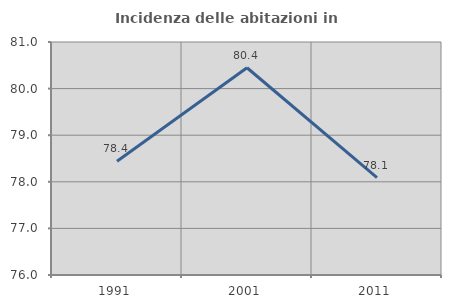
| Category | Incidenza delle abitazioni in proprietà  |
|---|---|
| 1991.0 | 78.44 |
| 2001.0 | 80.447 |
| 2011.0 | 78.09 |